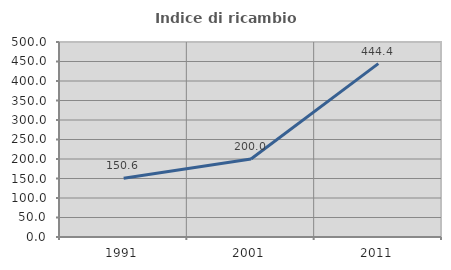
| Category | Indice di ricambio occupazionale  |
|---|---|
| 1991.0 | 150.562 |
| 2001.0 | 200 |
| 2011.0 | 444.444 |